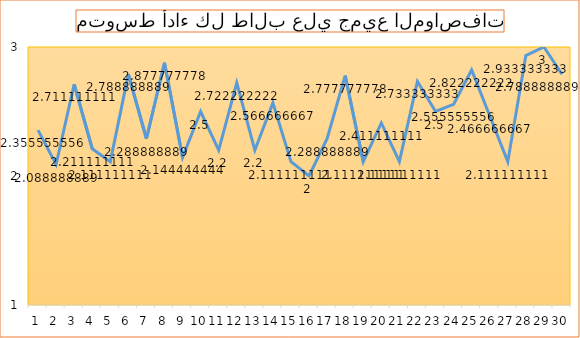
| Category | Series 0 |
|---|---|
| 0 | 2.356 |
| 1 | 2.089 |
| 2 | 2.711 |
| 3 | 2.211 |
| 4 | 2.111 |
| 5 | 2.789 |
| 6 | 2.289 |
| 7 | 2.878 |
| 8 | 2.144 |
| 9 | 2.5 |
| 10 | 2.2 |
| 11 | 2.722 |
| 12 | 2.2 |
| 13 | 2.567 |
| 14 | 2.111 |
| 15 | 2 |
| 16 | 2.289 |
| 17 | 2.778 |
| 18 | 2.111 |
| 19 | 2.411 |
| 20 | 2.111 |
| 21 | 2.733 |
| 22 | 2.5 |
| 23 | 2.556 |
| 24 | 2.822 |
| 25 | 2.467 |
| 26 | 2.111 |
| 27 | 2.933 |
| 28 | 3 |
| 29 | 2.789 |